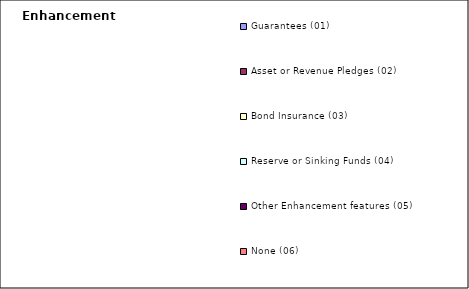
| Category | Enhancement Feature |
|---|---|
| Guarantees (01) | 0 |
| Asset or Revenue Pledges (02) | 0 |
| Bond Insurance (03) | 0 |
| Reserve or Sinking Funds (04) | 0 |
| Other Enhancement features (05) | 0 |
| None (06) | 0 |